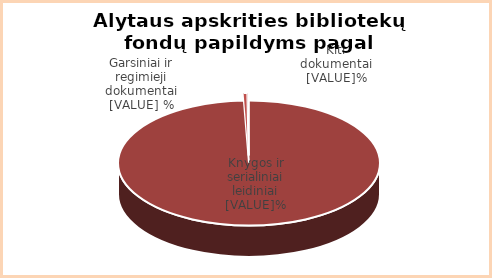
| Category | Series 0 |
|---|---|
| Knygos | 99.38 |
| Garsiniai | 0.46 |
| Kiti  | 0.16 |